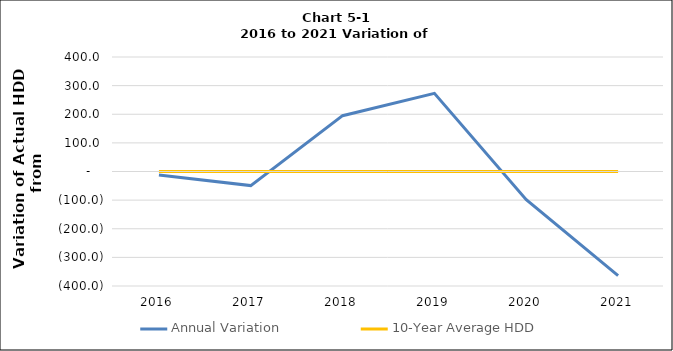
| Category |  Annual Variation  | 10-Year Average HDD |
|---|---|---|
| 2016.0 | -12.1 | 0 |
| 2017.0 | -49.3 | 0 |
| 2018.0 | 195 | 0 |
| 2019.0 | 273.11 | 0 |
| 2020.0 | -98.2 | 0 |
| 2021.0 | -364.04 | 0 |